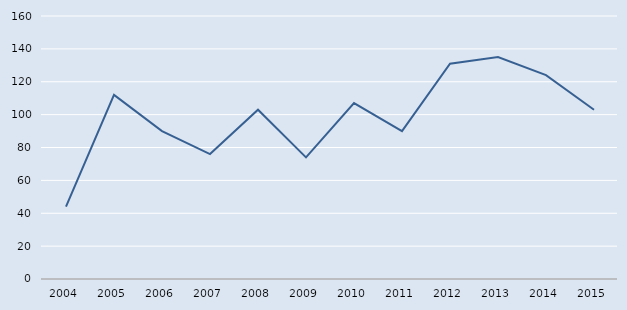
| Category | Series 0 |
|---|---|
| 2004.0 | 44 |
| 2005.0 | 112 |
| 2006.0 | 90 |
| 2007.0 | 76 |
| 2008.0 | 103 |
| 2009.0 | 74 |
| 2010.0 | 107 |
| 2011.0 | 90 |
| 2012.0 | 131 |
| 2013.0 | 135 |
| 2014.0 | 124 |
| 2015.0 | 103 |